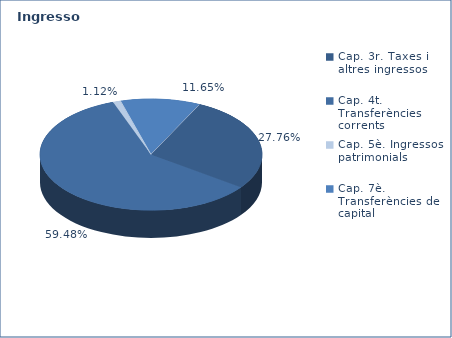
| Category | Series 0 |
|---|---|
| Cap. 3r. Taxes i altres ingressos | 84356743 |
| Cap. 4t. Transferències corrents | 180757816 |
| Cap. 5è. Ingressos patrimonials | 3389400 |
| Cap. 7è. Transferències de capital | 35388388 |
| Cap. 8è. Actius financers | 0 |
| Cap. 9è. Préstecs | 0 |